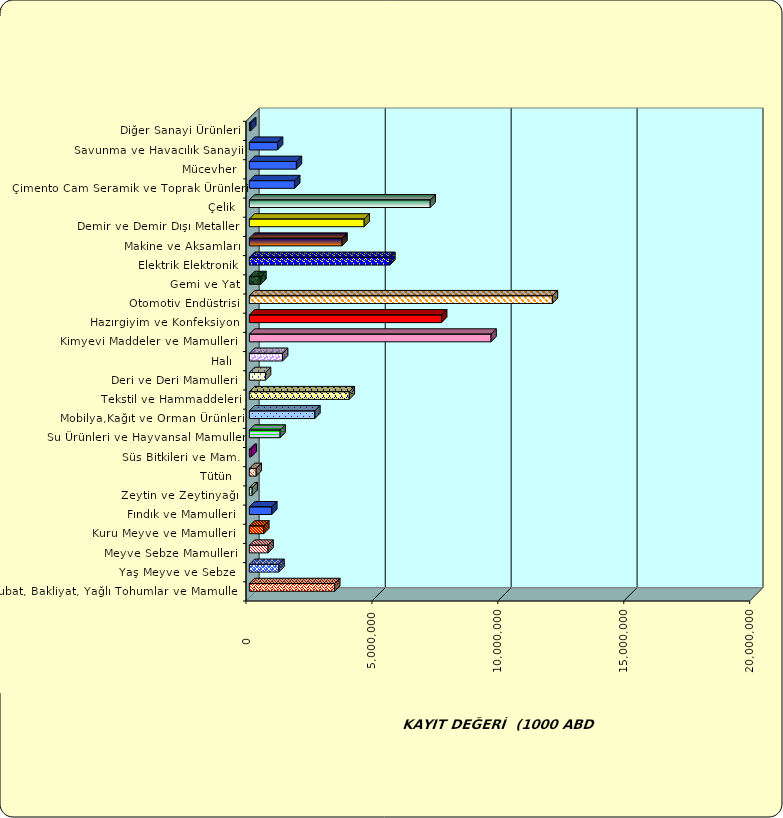
| Category | Series 0 |
|---|---|
|  Hububat, Bakliyat, Yağlı Tohumlar ve Mamulleri  | 3389509.095 |
|  Yaş Meyve ve Sebze   | 1177197.341 |
|  Meyve Sebze Mamulleri  | 742584.971 |
|  Kuru Meyve ve Mamulleri   | 574057.238 |
|  Fındık ve Mamulleri  | 890481.023 |
|  Zeytin ve Zeytinyağı  | 113148.307 |
|  Tütün  | 272129.549 |
|  Süs Bitkileri ve Mam. | 75709.25 |
|  Su Ürünleri ve Hayvansal Mamuller | 1221159.601 |
|  Mobilya,Kağıt ve Orman Ürünleri | 2601225.561 |
|  Tekstil ve Hammaddeleri | 3967675.002 |
|  Deri ve Deri Mamulleri  | 640593.136 |
|  Halı  | 1319658.174 |
|  Kimyevi Maddeler ve Mamulleri   | 9597643.495 |
|  Hazırgiyim ve Konfeksiyon  | 7634816.032 |
|  Otomotiv Endüstrisi | 12033047.659 |
|  Gemi ve Yat | 457094.857 |
|  Elektrik Elektronik | 5579679.604 |
|  Makine ve Aksamları | 3678061.892 |
|  Demir ve Demir Dışı Metaller  | 4559517.474 |
|  Çelik | 7182551.752 |
|  Çimento Cam Seramik ve Toprak Ürünleri | 1799100.487 |
|  Mücevher | 1869047.315 |
|  Savunma ve Havacılık Sanayii | 1120090.774 |
|  Diğer Sanayi Ürünleri | 54568.229 |